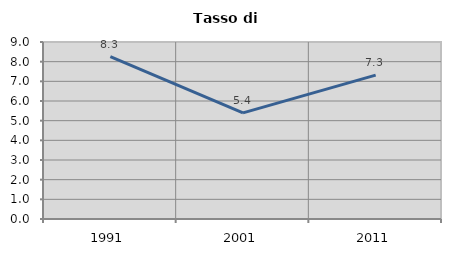
| Category | Tasso di disoccupazione   |
|---|---|
| 1991.0 | 8.252 |
| 2001.0 | 5.395 |
| 2011.0 | 7.315 |